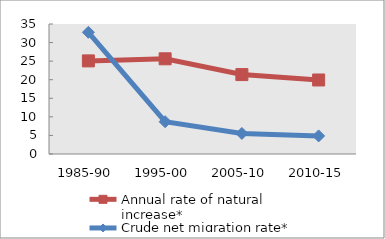
| Category | Annual rate of natural increase* | Crude net migration rate* |
|---|---|---|
| 1985-90 | 25.064 | 32.759 |
| 1995-00 | 25.628 | 8.687 |
| 2005-10 | 21.385 | 5.54 |
| 2010-15 | 19.931 | 4.869 |